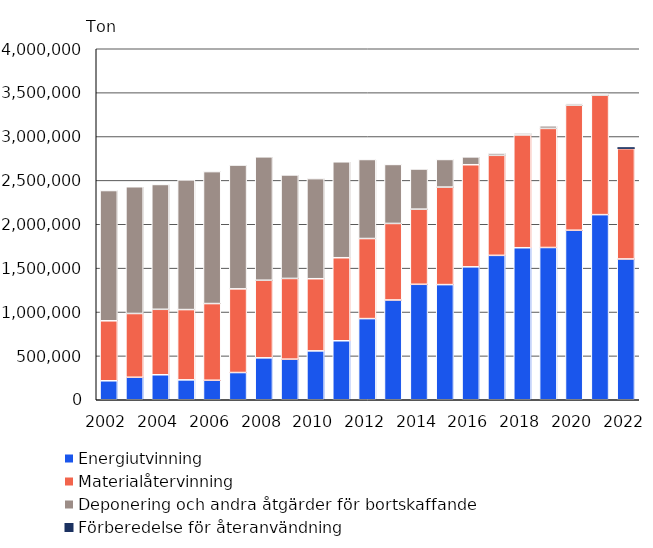
| Category | Energiutvinning | Materialåtervinning | Deponering och andra åtgärder för bortskaffande | Förberedelse för återanvändning |
|---|---|---|---|---|
| 2002.0 | 216314 | 683543 | 1484559 | 0 |
| 2003.0 | 256311 | 726671 | 1444541 | 0 |
| 2004.0 | 284895 | 745852 | 1422692 | 0 |
| 2005.0 | 226843 | 800784 | 1478123 | 0 |
| 2006.0 | 222323 | 873878 | 1503910 | 0 |
| 2007.0 | 310350 | 953274 | 1411294 | 0 |
| 2008.0 | 477794 | 884304 | 1406105 | 0 |
| 2009.0 | 462750 | 919830 | 1179840 | 0 |
| 2010.0 | 557131 | 822152 | 1140721 | 0 |
| 2011.0 | 672209 | 946234 | 1093277 | 0 |
| 2012.0 | 924825 | 912596 | 900674 | 0 |
| 2013.0 | 1136939 | 872210 | 672398 | 0 |
| 2014.0 | 1315820 | 856326 | 457733 | 0 |
| 2015.0 | 1312180 | 1111338 | 314762 | 0 |
| 2016.0 | 1514830 | 1163566 | 89535 | 0 |
| 2017.0 | 1645554 | 1140133 | 25902 | 0 |
| 2018.0 | 1732450 | 1285711 | 21949 | 0 |
| 2019.0 | 1735109 | 1357227 | 29669 | 0 |
| 2020.0 | 1931974 | 1424280 | 18016 | 0 |
| 2021.0 | 2109565 | 1360524 | 14499 | 0 |
| 2022.0 | 1604394 | 1257747 | 10660 | 8295 |